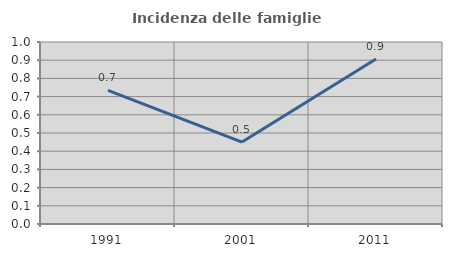
| Category | Incidenza delle famiglie numerose |
|---|---|
| 1991.0 | 0.734 |
| 2001.0 | 0.45 |
| 2011.0 | 0.906 |